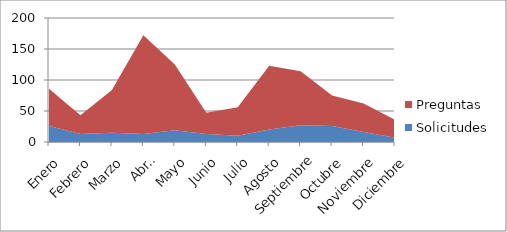
| Category | Solicitudes | Preguntas |
|---|---|---|
| Enero | 26 | 60 |
| Febrero | 13 | 30 |
| Marzo | 15 | 69 |
| Abril | 13 | 159 |
| Mayo | 19 | 106 |
| Junio | 13 | 34 |
| Julio | 10 | 46 |
| Agosto | 20 | 103 |
| Septiembre | 27 | 87 |
| Octubre | 26 | 49 |
| Noviembre | 16 | 46 |
| Diciembre | 7 | 29 |